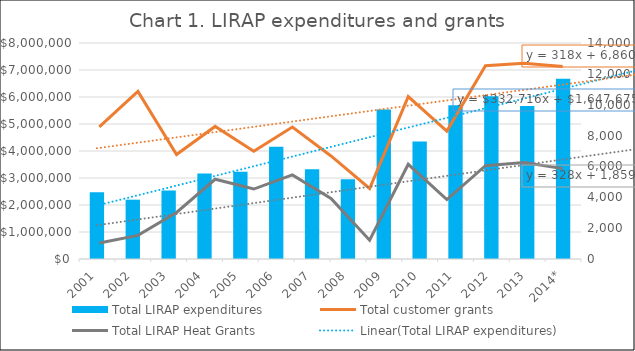
| Category | Total LIRAP expenditures |
|---|---|
| 2001 | 2476529 |
| 2002 | 2197150 |
| 2003 | 2533916 |
| 2004 | 3169051 |
| 2005 | 3230665 |
| 2006 | 4155463 |
| 2007 | 3320239 |
| 2008 | 2955033 |
| 2009 | 5534638 |
| 2010 | 4351409 |
| 2011 | 5698838 |
| 2012 | 6030999 |
| 2013 | 5671179 |
| 2014* | 6677549 |